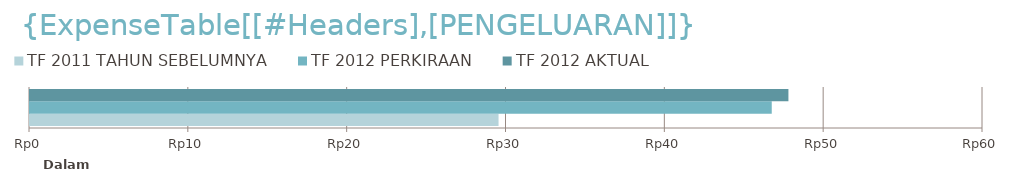
| Category | TF 2011 | TF 2012 |
|---|---|---|
| 0 | 29500 | 47750 |